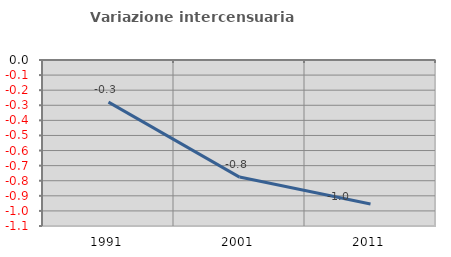
| Category | Variazione intercensuaria annua |
|---|---|
| 1991.0 | -0.279 |
| 2001.0 | -0.776 |
| 2011.0 | -0.954 |